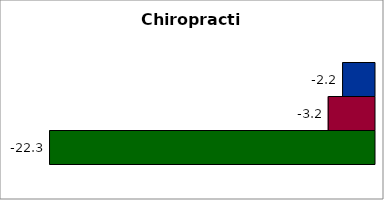
| Category | 50 states and D.C. | SREB states | State |
|---|---|---|---|
| 0 | -2.191 | -3.179 | -22.319 |